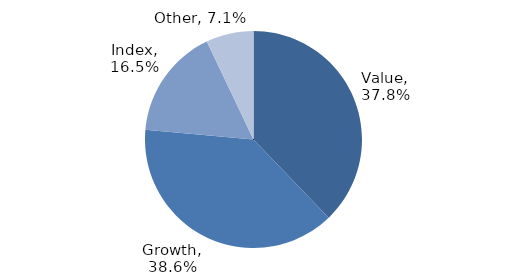
| Category | Investment Style |
|---|---|
| Value | 0.378 |
| Growth | 0.386 |
| Index | 0.165 |
| Other | 0.071 |